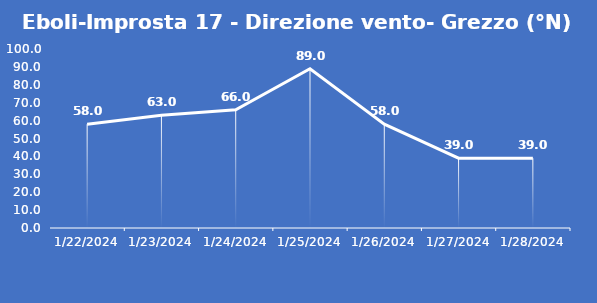
| Category | Eboli-Improsta 17 - Direzione vento- Grezzo (°N) |
|---|---|
| 1/22/24 | 58 |
| 1/23/24 | 63 |
| 1/24/24 | 66 |
| 1/25/24 | 89 |
| 1/26/24 | 58 |
| 1/27/24 | 39 |
| 1/28/24 | 39 |